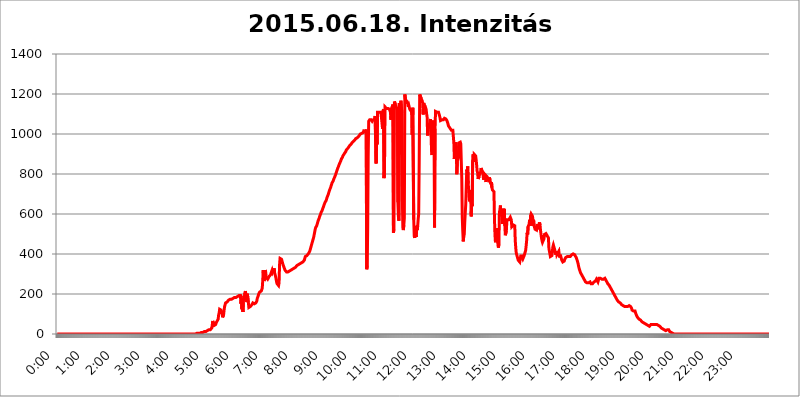
| Category | 2015.06.18. Intenzitás [W/m^2] |
|---|---|
| 0.0 | 0 |
| 0.0006944444444444445 | 0 |
| 0.001388888888888889 | 0 |
| 0.0020833333333333333 | 0 |
| 0.002777777777777778 | 0 |
| 0.003472222222222222 | 0 |
| 0.004166666666666667 | 0 |
| 0.004861111111111111 | 0 |
| 0.005555555555555556 | 0 |
| 0.0062499999999999995 | 0 |
| 0.006944444444444444 | 0 |
| 0.007638888888888889 | 0 |
| 0.008333333333333333 | 0 |
| 0.009027777777777779 | 0 |
| 0.009722222222222222 | 0 |
| 0.010416666666666666 | 0 |
| 0.011111111111111112 | 0 |
| 0.011805555555555555 | 0 |
| 0.012499999999999999 | 0 |
| 0.013194444444444444 | 0 |
| 0.013888888888888888 | 0 |
| 0.014583333333333332 | 0 |
| 0.015277777777777777 | 0 |
| 0.015972222222222224 | 0 |
| 0.016666666666666666 | 0 |
| 0.017361111111111112 | 0 |
| 0.018055555555555557 | 0 |
| 0.01875 | 0 |
| 0.019444444444444445 | 0 |
| 0.02013888888888889 | 0 |
| 0.020833333333333332 | 0 |
| 0.02152777777777778 | 0 |
| 0.022222222222222223 | 0 |
| 0.02291666666666667 | 0 |
| 0.02361111111111111 | 0 |
| 0.024305555555555556 | 0 |
| 0.024999999999999998 | 0 |
| 0.025694444444444447 | 0 |
| 0.02638888888888889 | 0 |
| 0.027083333333333334 | 0 |
| 0.027777777777777776 | 0 |
| 0.02847222222222222 | 0 |
| 0.029166666666666664 | 0 |
| 0.029861111111111113 | 0 |
| 0.030555555555555555 | 0 |
| 0.03125 | 0 |
| 0.03194444444444445 | 0 |
| 0.03263888888888889 | 0 |
| 0.03333333333333333 | 0 |
| 0.034027777777777775 | 0 |
| 0.034722222222222224 | 0 |
| 0.035416666666666666 | 0 |
| 0.036111111111111115 | 0 |
| 0.03680555555555556 | 0 |
| 0.0375 | 0 |
| 0.03819444444444444 | 0 |
| 0.03888888888888889 | 0 |
| 0.03958333333333333 | 0 |
| 0.04027777777777778 | 0 |
| 0.04097222222222222 | 0 |
| 0.041666666666666664 | 0 |
| 0.042361111111111106 | 0 |
| 0.04305555555555556 | 0 |
| 0.043750000000000004 | 0 |
| 0.044444444444444446 | 0 |
| 0.04513888888888889 | 0 |
| 0.04583333333333334 | 0 |
| 0.04652777777777778 | 0 |
| 0.04722222222222222 | 0 |
| 0.04791666666666666 | 0 |
| 0.04861111111111111 | 0 |
| 0.049305555555555554 | 0 |
| 0.049999999999999996 | 0 |
| 0.05069444444444445 | 0 |
| 0.051388888888888894 | 0 |
| 0.052083333333333336 | 0 |
| 0.05277777777777778 | 0 |
| 0.05347222222222222 | 0 |
| 0.05416666666666667 | 0 |
| 0.05486111111111111 | 0 |
| 0.05555555555555555 | 0 |
| 0.05625 | 0 |
| 0.05694444444444444 | 0 |
| 0.057638888888888885 | 0 |
| 0.05833333333333333 | 0 |
| 0.05902777777777778 | 0 |
| 0.059722222222222225 | 0 |
| 0.06041666666666667 | 0 |
| 0.061111111111111116 | 0 |
| 0.06180555555555556 | 0 |
| 0.0625 | 0 |
| 0.06319444444444444 | 0 |
| 0.06388888888888888 | 0 |
| 0.06458333333333334 | 0 |
| 0.06527777777777778 | 0 |
| 0.06597222222222222 | 0 |
| 0.06666666666666667 | 0 |
| 0.06736111111111111 | 0 |
| 0.06805555555555555 | 0 |
| 0.06874999999999999 | 0 |
| 0.06944444444444443 | 0 |
| 0.07013888888888889 | 0 |
| 0.07083333333333333 | 0 |
| 0.07152777777777779 | 0 |
| 0.07222222222222223 | 0 |
| 0.07291666666666667 | 0 |
| 0.07361111111111111 | 0 |
| 0.07430555555555556 | 0 |
| 0.075 | 0 |
| 0.07569444444444444 | 0 |
| 0.0763888888888889 | 0 |
| 0.07708333333333334 | 0 |
| 0.07777777777777778 | 0 |
| 0.07847222222222222 | 0 |
| 0.07916666666666666 | 0 |
| 0.0798611111111111 | 0 |
| 0.08055555555555556 | 0 |
| 0.08125 | 0 |
| 0.08194444444444444 | 0 |
| 0.08263888888888889 | 0 |
| 0.08333333333333333 | 0 |
| 0.08402777777777777 | 0 |
| 0.08472222222222221 | 0 |
| 0.08541666666666665 | 0 |
| 0.08611111111111112 | 0 |
| 0.08680555555555557 | 0 |
| 0.08750000000000001 | 0 |
| 0.08819444444444445 | 0 |
| 0.08888888888888889 | 0 |
| 0.08958333333333333 | 0 |
| 0.09027777777777778 | 0 |
| 0.09097222222222222 | 0 |
| 0.09166666666666667 | 0 |
| 0.09236111111111112 | 0 |
| 0.09305555555555556 | 0 |
| 0.09375 | 0 |
| 0.09444444444444444 | 0 |
| 0.09513888888888888 | 0 |
| 0.09583333333333333 | 0 |
| 0.09652777777777777 | 0 |
| 0.09722222222222222 | 0 |
| 0.09791666666666667 | 0 |
| 0.09861111111111111 | 0 |
| 0.09930555555555555 | 0 |
| 0.09999999999999999 | 0 |
| 0.10069444444444443 | 0 |
| 0.1013888888888889 | 0 |
| 0.10208333333333335 | 0 |
| 0.10277777777777779 | 0 |
| 0.10347222222222223 | 0 |
| 0.10416666666666667 | 0 |
| 0.10486111111111111 | 0 |
| 0.10555555555555556 | 0 |
| 0.10625 | 0 |
| 0.10694444444444444 | 0 |
| 0.1076388888888889 | 0 |
| 0.10833333333333334 | 0 |
| 0.10902777777777778 | 0 |
| 0.10972222222222222 | 0 |
| 0.1111111111111111 | 0 |
| 0.11180555555555556 | 0 |
| 0.11180555555555556 | 0 |
| 0.1125 | 0 |
| 0.11319444444444444 | 0 |
| 0.11388888888888889 | 0 |
| 0.11458333333333333 | 0 |
| 0.11527777777777777 | 0 |
| 0.11597222222222221 | 0 |
| 0.11666666666666665 | 0 |
| 0.1173611111111111 | 0 |
| 0.11805555555555557 | 0 |
| 0.11944444444444445 | 0 |
| 0.12013888888888889 | 0 |
| 0.12083333333333333 | 0 |
| 0.12152777777777778 | 0 |
| 0.12222222222222223 | 0 |
| 0.12291666666666667 | 0 |
| 0.12291666666666667 | 0 |
| 0.12361111111111112 | 0 |
| 0.12430555555555556 | 0 |
| 0.125 | 0 |
| 0.12569444444444444 | 0 |
| 0.12638888888888888 | 0 |
| 0.12708333333333333 | 0 |
| 0.16875 | 0 |
| 0.12847222222222224 | 0 |
| 0.12916666666666668 | 0 |
| 0.12986111111111112 | 0 |
| 0.13055555555555556 | 0 |
| 0.13125 | 0 |
| 0.13194444444444445 | 0 |
| 0.1326388888888889 | 0 |
| 0.13333333333333333 | 0 |
| 0.13402777777777777 | 0 |
| 0.13402777777777777 | 0 |
| 0.13472222222222222 | 0 |
| 0.13541666666666666 | 0 |
| 0.1361111111111111 | 0 |
| 0.13749999999999998 | 0 |
| 0.13819444444444443 | 0 |
| 0.1388888888888889 | 0 |
| 0.13958333333333334 | 0 |
| 0.14027777777777778 | 0 |
| 0.14097222222222222 | 0 |
| 0.14166666666666666 | 0 |
| 0.1423611111111111 | 0 |
| 0.14305555555555557 | 0 |
| 0.14375000000000002 | 0 |
| 0.14444444444444446 | 0 |
| 0.1451388888888889 | 0 |
| 0.1451388888888889 | 0 |
| 0.14652777777777778 | 0 |
| 0.14722222222222223 | 0 |
| 0.14791666666666667 | 0 |
| 0.1486111111111111 | 0 |
| 0.14930555555555555 | 0 |
| 0.15 | 0 |
| 0.15069444444444444 | 0 |
| 0.15138888888888888 | 0 |
| 0.15208333333333332 | 0 |
| 0.15277777777777776 | 0 |
| 0.15347222222222223 | 0 |
| 0.15416666666666667 | 0 |
| 0.15486111111111112 | 0 |
| 0.15555555555555556 | 0 |
| 0.15625 | 0 |
| 0.15694444444444444 | 0 |
| 0.15763888888888888 | 0 |
| 0.15833333333333333 | 0 |
| 0.15902777777777777 | 0 |
| 0.15972222222222224 | 0 |
| 0.16041666666666668 | 0 |
| 0.16111111111111112 | 0 |
| 0.16180555555555556 | 0 |
| 0.1625 | 0 |
| 0.16319444444444445 | 0 |
| 0.1638888888888889 | 0 |
| 0.16458333333333333 | 0 |
| 0.16527777777777777 | 0 |
| 0.16597222222222222 | 0 |
| 0.16666666666666666 | 0 |
| 0.1673611111111111 | 0 |
| 0.16805555555555554 | 0 |
| 0.16874999999999998 | 0 |
| 0.16944444444444443 | 0 |
| 0.17013888888888887 | 0 |
| 0.1708333333333333 | 0 |
| 0.17152777777777775 | 0 |
| 0.17222222222222225 | 0 |
| 0.1729166666666667 | 0 |
| 0.17361111111111113 | 0 |
| 0.17430555555555557 | 0 |
| 0.17500000000000002 | 0 |
| 0.17569444444444446 | 0 |
| 0.1763888888888889 | 0 |
| 0.17708333333333334 | 0 |
| 0.17777777777777778 | 0 |
| 0.17847222222222223 | 0 |
| 0.17916666666666667 | 0 |
| 0.1798611111111111 | 0 |
| 0.18055555555555555 | 0 |
| 0.18125 | 0 |
| 0.18194444444444444 | 0 |
| 0.1826388888888889 | 0 |
| 0.18333333333333335 | 0 |
| 0.1840277777777778 | 0 |
| 0.18472222222222223 | 0 |
| 0.18541666666666667 | 0 |
| 0.18611111111111112 | 0 |
| 0.18680555555555556 | 0 |
| 0.1875 | 0 |
| 0.18819444444444444 | 0 |
| 0.18888888888888888 | 0 |
| 0.18958333333333333 | 0 |
| 0.19027777777777777 | 0 |
| 0.1909722222222222 | 0 |
| 0.19166666666666665 | 0 |
| 0.19236111111111112 | 0 |
| 0.19305555555555554 | 0 |
| 0.19375 | 0 |
| 0.19444444444444445 | 0 |
| 0.1951388888888889 | 3.525 |
| 0.19583333333333333 | 3.525 |
| 0.19652777777777777 | 3.525 |
| 0.19722222222222222 | 3.525 |
| 0.19791666666666666 | 3.525 |
| 0.1986111111111111 | 3.525 |
| 0.19930555555555554 | 3.525 |
| 0.19999999999999998 | 3.525 |
| 0.20069444444444443 | 3.525 |
| 0.20138888888888887 | 7.887 |
| 0.2020833333333333 | 7.887 |
| 0.2027777777777778 | 7.887 |
| 0.2034722222222222 | 7.887 |
| 0.2041666666666667 | 7.887 |
| 0.20486111111111113 | 7.887 |
| 0.20555555555555557 | 12.257 |
| 0.20625000000000002 | 12.257 |
| 0.20694444444444446 | 12.257 |
| 0.2076388888888889 | 12.257 |
| 0.20833333333333334 | 12.257 |
| 0.20902777777777778 | 12.257 |
| 0.20972222222222223 | 16.636 |
| 0.21041666666666667 | 16.636 |
| 0.2111111111111111 | 16.636 |
| 0.21180555555555555 | 16.636 |
| 0.2125 | 21.024 |
| 0.21319444444444444 | 21.024 |
| 0.2138888888888889 | 21.024 |
| 0.21458333333333335 | 21.024 |
| 0.2152777777777778 | 25.419 |
| 0.21597222222222223 | 25.419 |
| 0.21666666666666667 | 29.823 |
| 0.21736111111111112 | 43.079 |
| 0.21805555555555556 | 65.31 |
| 0.21875 | 69.775 |
| 0.21944444444444444 | 60.85 |
| 0.22013888888888888 | 43.079 |
| 0.22083333333333333 | 38.653 |
| 0.22152777777777777 | 43.079 |
| 0.2222222222222222 | 47.511 |
| 0.22291666666666665 | 56.398 |
| 0.2236111111111111 | 60.85 |
| 0.22430555555555556 | 65.31 |
| 0.225 | 65.31 |
| 0.22569444444444445 | 74.246 |
| 0.2263888888888889 | 96.682 |
| 0.22708333333333333 | 105.69 |
| 0.22777777777777777 | 123.758 |
| 0.22847222222222222 | 128.284 |
| 0.22916666666666666 | 123.758 |
| 0.2298611111111111 | 119.235 |
| 0.23055555555555554 | 123.758 |
| 0.23124999999999998 | 101.184 |
| 0.23194444444444443 | 83.205 |
| 0.23263888888888887 | 83.205 |
| 0.2333333333333333 | 96.682 |
| 0.2340277777777778 | 119.235 |
| 0.2347222222222222 | 137.347 |
| 0.2354166666666667 | 146.423 |
| 0.23611111111111113 | 155.509 |
| 0.23680555555555557 | 155.509 |
| 0.23750000000000002 | 160.056 |
| 0.23819444444444446 | 160.056 |
| 0.2388888888888889 | 164.605 |
| 0.23958333333333334 | 164.605 |
| 0.24027777777777778 | 169.156 |
| 0.24097222222222223 | 169.156 |
| 0.24166666666666667 | 173.709 |
| 0.2423611111111111 | 173.709 |
| 0.24305555555555555 | 173.709 |
| 0.24375 | 173.709 |
| 0.24444444444444446 | 173.709 |
| 0.24513888888888888 | 178.264 |
| 0.24583333333333335 | 178.264 |
| 0.2465277777777778 | 178.264 |
| 0.24722222222222223 | 178.264 |
| 0.24791666666666667 | 182.82 |
| 0.24861111111111112 | 182.82 |
| 0.24930555555555556 | 182.82 |
| 0.25 | 182.82 |
| 0.25069444444444444 | 182.82 |
| 0.2513888888888889 | 187.378 |
| 0.2520833333333333 | 187.378 |
| 0.25277777777777777 | 187.378 |
| 0.2534722222222222 | 187.378 |
| 0.25416666666666665 | 191.937 |
| 0.2548611111111111 | 191.937 |
| 0.2555555555555556 | 191.937 |
| 0.25625000000000003 | 196.497 |
| 0.2569444444444445 | 191.937 |
| 0.2576388888888889 | 150.964 |
| 0.25833333333333336 | 173.709 |
| 0.2590277777777778 | 123.758 |
| 0.25972222222222224 | 155.509 |
| 0.2604166666666667 | 110.201 |
| 0.2611111111111111 | 173.709 |
| 0.26180555555555557 | 191.937 |
| 0.2625 | 173.709 |
| 0.26319444444444445 | 205.62 |
| 0.2638888888888889 | 214.746 |
| 0.26458333333333334 | 214.746 |
| 0.2652777777777778 | 219.309 |
| 0.2659722222222222 | 160.056 |
| 0.26666666666666666 | 201.058 |
| 0.2673611111111111 | 205.62 |
| 0.26805555555555555 | 155.509 |
| 0.26875 | 132.814 |
| 0.26944444444444443 | 137.347 |
| 0.2701388888888889 | 137.347 |
| 0.2708333333333333 | 137.347 |
| 0.27152777777777776 | 137.347 |
| 0.2722222222222222 | 141.884 |
| 0.27291666666666664 | 146.423 |
| 0.2736111111111111 | 150.964 |
| 0.2743055555555555 | 155.509 |
| 0.27499999999999997 | 150.964 |
| 0.27569444444444446 | 150.964 |
| 0.27638888888888885 | 150.964 |
| 0.27708333333333335 | 150.964 |
| 0.2777777777777778 | 150.964 |
| 0.27847222222222223 | 155.509 |
| 0.2791666666666667 | 160.056 |
| 0.2798611111111111 | 164.605 |
| 0.28055555555555556 | 178.264 |
| 0.28125 | 182.82 |
| 0.28194444444444444 | 191.937 |
| 0.2826388888888889 | 201.058 |
| 0.2833333333333333 | 205.62 |
| 0.28402777777777777 | 210.182 |
| 0.2847222222222222 | 214.746 |
| 0.28541666666666665 | 214.746 |
| 0.28611111111111115 | 214.746 |
| 0.28680555555555554 | 219.309 |
| 0.28750000000000003 | 228.436 |
| 0.2881944444444445 | 264.932 |
| 0.2888888888888889 | 319.517 |
| 0.28958333333333336 | 278.603 |
| 0.2902777777777778 | 264.932 |
| 0.29097222222222224 | 283.156 |
| 0.2916666666666667 | 319.517 |
| 0.2923611111111111 | 310.44 |
| 0.29305555555555557 | 283.156 |
| 0.29375 | 278.603 |
| 0.29444444444444445 | 278.603 |
| 0.2951388888888889 | 274.047 |
| 0.29583333333333334 | 278.603 |
| 0.2965277777777778 | 278.603 |
| 0.2972222222222222 | 287.709 |
| 0.29791666666666666 | 287.709 |
| 0.2986111111111111 | 287.709 |
| 0.29930555555555555 | 296.808 |
| 0.3 | 305.898 |
| 0.30069444444444443 | 310.44 |
| 0.3013888888888889 | 319.517 |
| 0.3020833333333333 | 310.44 |
| 0.30277777777777776 | 305.898 |
| 0.3034722222222222 | 310.44 |
| 0.30416666666666664 | 328.584 |
| 0.3048611111111111 | 305.898 |
| 0.3055555555555555 | 296.808 |
| 0.30624999999999997 | 287.709 |
| 0.3069444444444444 | 287.709 |
| 0.3076388888888889 | 260.373 |
| 0.30833333333333335 | 251.251 |
| 0.3090277777777778 | 251.251 |
| 0.30972222222222223 | 246.689 |
| 0.3104166666666667 | 242.127 |
| 0.3111111111111111 | 255.813 |
| 0.31180555555555556 | 346.682 |
| 0.3125 | 378.224 |
| 0.31319444444444444 | 382.715 |
| 0.3138888888888889 | 378.224 |
| 0.3145833333333333 | 373.729 |
| 0.31527777777777777 | 364.728 |
| 0.3159722222222222 | 355.712 |
| 0.31666666666666665 | 346.682 |
| 0.31736111111111115 | 342.162 |
| 0.31805555555555554 | 333.113 |
| 0.31875000000000003 | 328.584 |
| 0.3194444444444445 | 319.517 |
| 0.3201388888888889 | 314.98 |
| 0.32083333333333336 | 314.98 |
| 0.3215277777777778 | 310.44 |
| 0.32222222222222224 | 310.44 |
| 0.3229166666666667 | 310.44 |
| 0.3236111111111111 | 310.44 |
| 0.32430555555555557 | 310.44 |
| 0.325 | 310.44 |
| 0.32569444444444445 | 314.98 |
| 0.3263888888888889 | 314.98 |
| 0.32708333333333334 | 314.98 |
| 0.3277777777777778 | 319.517 |
| 0.3284722222222222 | 319.517 |
| 0.32916666666666666 | 319.517 |
| 0.3298611111111111 | 324.052 |
| 0.33055555555555555 | 324.052 |
| 0.33125 | 324.052 |
| 0.33194444444444443 | 328.584 |
| 0.3326388888888889 | 333.113 |
| 0.3333333333333333 | 333.113 |
| 0.3340277777777778 | 333.113 |
| 0.3347222222222222 | 337.639 |
| 0.3354166666666667 | 337.639 |
| 0.3361111111111111 | 342.162 |
| 0.3368055555555556 | 342.162 |
| 0.33749999999999997 | 346.682 |
| 0.33819444444444446 | 346.682 |
| 0.33888888888888885 | 351.198 |
| 0.33958333333333335 | 351.198 |
| 0.34027777777777773 | 351.198 |
| 0.34097222222222223 | 351.198 |
| 0.3416666666666666 | 355.712 |
| 0.3423611111111111 | 355.712 |
| 0.3430555555555555 | 360.221 |
| 0.34375 | 360.221 |
| 0.3444444444444445 | 360.221 |
| 0.3451388888888889 | 364.728 |
| 0.3458333333333334 | 364.728 |
| 0.34652777777777777 | 369.23 |
| 0.34722222222222227 | 369.23 |
| 0.34791666666666665 | 387.202 |
| 0.34861111111111115 | 387.202 |
| 0.34930555555555554 | 387.202 |
| 0.35000000000000003 | 391.685 |
| 0.3506944444444444 | 396.164 |
| 0.3513888888888889 | 396.164 |
| 0.3520833333333333 | 400.638 |
| 0.3527777777777778 | 400.638 |
| 0.3534722222222222 | 405.108 |
| 0.3541666666666667 | 414.035 |
| 0.3548611111111111 | 422.943 |
| 0.35555555555555557 | 431.833 |
| 0.35625 | 440.702 |
| 0.35694444444444445 | 449.551 |
| 0.3576388888888889 | 458.38 |
| 0.35833333333333334 | 467.187 |
| 0.3590277777777778 | 475.972 |
| 0.3597222222222222 | 484.735 |
| 0.36041666666666666 | 497.836 |
| 0.3611111111111111 | 510.885 |
| 0.36180555555555555 | 523.88 |
| 0.3625 | 532.513 |
| 0.36319444444444443 | 536.82 |
| 0.3638888888888889 | 541.121 |
| 0.3645833333333333 | 549.704 |
| 0.3652777777777778 | 558.261 |
| 0.3659722222222222 | 566.793 |
| 0.3666666666666667 | 571.049 |
| 0.3673611111111111 | 579.542 |
| 0.3680555555555556 | 588.009 |
| 0.36874999999999997 | 592.233 |
| 0.36944444444444446 | 600.661 |
| 0.37013888888888885 | 609.062 |
| 0.37083333333333335 | 613.252 |
| 0.37152777777777773 | 617.436 |
| 0.37222222222222223 | 625.784 |
| 0.3729166666666666 | 629.948 |
| 0.3736111111111111 | 638.256 |
| 0.3743055555555555 | 646.537 |
| 0.375 | 650.667 |
| 0.3756944444444445 | 658.909 |
| 0.3763888888888889 | 663.019 |
| 0.3770833333333334 | 667.123 |
| 0.37777777777777777 | 675.311 |
| 0.37847222222222227 | 683.473 |
| 0.37916666666666665 | 687.544 |
| 0.37986111111111115 | 695.666 |
| 0.38055555555555554 | 699.717 |
| 0.38125000000000003 | 711.832 |
| 0.3819444444444444 | 719.877 |
| 0.3826388888888889 | 723.889 |
| 0.3833333333333333 | 731.896 |
| 0.3840277777777778 | 739.877 |
| 0.3847222222222222 | 747.834 |
| 0.3854166666666667 | 755.766 |
| 0.3861111111111111 | 759.723 |
| 0.38680555555555557 | 763.674 |
| 0.3875 | 771.559 |
| 0.38819444444444445 | 775.492 |
| 0.3888888888888889 | 783.342 |
| 0.38958333333333334 | 787.258 |
| 0.3902777777777778 | 795.074 |
| 0.3909722222222222 | 802.868 |
| 0.39166666666666666 | 806.757 |
| 0.3923611111111111 | 818.392 |
| 0.39305555555555555 | 826.123 |
| 0.39375 | 829.981 |
| 0.39444444444444443 | 837.682 |
| 0.3951388888888889 | 845.365 |
| 0.3958333333333333 | 849.199 |
| 0.3965277777777778 | 856.855 |
| 0.3972222222222222 | 860.676 |
| 0.3979166666666667 | 868.305 |
| 0.3986111111111111 | 875.918 |
| 0.3993055555555556 | 879.719 |
| 0.39999999999999997 | 883.516 |
| 0.40069444444444446 | 891.099 |
| 0.40138888888888885 | 894.885 |
| 0.40208333333333335 | 898.668 |
| 0.40277777777777773 | 902.447 |
| 0.40347222222222223 | 906.223 |
| 0.4041666666666666 | 909.996 |
| 0.4048611111111111 | 913.766 |
| 0.4055555555555555 | 921.298 |
| 0.40625 | 925.06 |
| 0.4069444444444445 | 925.06 |
| 0.4076388888888889 | 928.819 |
| 0.4083333333333334 | 932.576 |
| 0.40902777777777777 | 932.576 |
| 0.40972222222222227 | 940.082 |
| 0.41041666666666665 | 940.082 |
| 0.41111111111111115 | 943.832 |
| 0.41180555555555554 | 947.58 |
| 0.41250000000000003 | 947.58 |
| 0.4131944444444444 | 955.071 |
| 0.4138888888888889 | 955.071 |
| 0.4145833333333333 | 958.814 |
| 0.4152777777777778 | 962.555 |
| 0.4159722222222222 | 962.555 |
| 0.4166666666666667 | 966.295 |
| 0.4173611111111111 | 970.034 |
| 0.41805555555555557 | 973.772 |
| 0.41875 | 977.508 |
| 0.41944444444444445 | 977.508 |
| 0.4201388888888889 | 977.508 |
| 0.42083333333333334 | 981.244 |
| 0.4215277777777778 | 981.244 |
| 0.4222222222222222 | 984.98 |
| 0.42291666666666666 | 988.714 |
| 0.4236111111111111 | 988.714 |
| 0.42430555555555555 | 992.448 |
| 0.425 | 999.916 |
| 0.42569444444444443 | 996.182 |
| 0.4263888888888889 | 999.916 |
| 0.4270833333333333 | 1003.65 |
| 0.4277777777777778 | 1003.65 |
| 0.4284722222222222 | 1007.383 |
| 0.4291666666666667 | 1007.383 |
| 0.4298611111111111 | 1014.852 |
| 0.4305555555555556 | 1011.118 |
| 0.43124999999999997 | 1011.118 |
| 0.43194444444444446 | 1011.118 |
| 0.43263888888888885 | 1014.852 |
| 0.43333333333333335 | 1022.323 |
| 0.43402777777777773 | 324.052 |
| 0.43472222222222223 | 342.162 |
| 0.4354166666666666 | 532.513 |
| 0.4361111111111111 | 887.309 |
| 0.4368055555555555 | 1063.51 |
| 0.4375 | 1063.51 |
| 0.4381944444444445 | 1071.027 |
| 0.4388888888888889 | 1071.027 |
| 0.4395833333333334 | 1074.789 |
| 0.44027777777777777 | 1071.027 |
| 0.44097222222222227 | 1067.267 |
| 0.44166666666666665 | 1063.51 |
| 0.44236111111111115 | 1067.267 |
| 0.44305555555555554 | 1071.027 |
| 0.44375000000000003 | 1067.267 |
| 0.4444444444444444 | 1071.027 |
| 0.4451388888888889 | 1074.789 |
| 0.4458333333333333 | 1089.873 |
| 0.4465277777777778 | 1093.653 |
| 0.4472222222222222 | 853.029 |
| 0.4479166666666667 | 970.034 |
| 0.4486111111111111 | 947.58 |
| 0.44930555555555557 | 1108.816 |
| 0.45 | 1108.816 |
| 0.45069444444444445 | 1105.019 |
| 0.4513888888888889 | 1108.816 |
| 0.45208333333333334 | 1112.618 |
| 0.4527777777777778 | 1112.618 |
| 0.4534722222222222 | 1108.816 |
| 0.45416666666666666 | 1101.226 |
| 0.4548611111111111 | 1101.226 |
| 0.45555555555555555 | 1101.226 |
| 0.45625 | 1026.06 |
| 0.45694444444444443 | 1116.426 |
| 0.4576388888888889 | 1124.056 |
| 0.4583333333333333 | 779.42 |
| 0.4590277777777778 | 826.123 |
| 0.4597222222222222 | 1135.543 |
| 0.4604166666666667 | 1139.384 |
| 0.4611111111111111 | 1131.708 |
| 0.4618055555555556 | 1127.879 |
| 0.46249999999999997 | 1124.056 |
| 0.46319444444444446 | 1127.879 |
| 0.46388888888888885 | 1127.879 |
| 0.46458333333333335 | 1124.056 |
| 0.46527777777777773 | 1124.056 |
| 0.46597222222222223 | 1124.056 |
| 0.4666666666666666 | 1124.056 |
| 0.4673611111111111 | 1108.816 |
| 0.4680555555555555 | 1071.027 |
| 0.46875 | 1127.879 |
| 0.4694444444444445 | 1127.879 |
| 0.4701388888888889 | 1139.384 |
| 0.4708333333333334 | 1147.086 |
| 0.47152777777777777 | 506.542 |
| 0.47222222222222227 | 523.88 |
| 0.47291666666666665 | 1162.571 |
| 0.47361111111111115 | 1158.689 |
| 0.47430555555555554 | 1147.086 |
| 0.47500000000000003 | 1139.384 |
| 0.4756944444444444 | 1139.384 |
| 0.4763888888888889 | 1127.879 |
| 0.4770833333333333 | 1135.543 |
| 0.4777777777777778 | 658.909 |
| 0.4784722222222222 | 588.009 |
| 0.4791666666666667 | 566.793 |
| 0.4798611111111111 | 1154.814 |
| 0.48055555555555557 | 898.668 |
| 0.48125 | 940.082 |
| 0.48194444444444445 | 1166.46 |
| 0.4826388888888889 | 1170.358 |
| 0.48333333333333334 | 1105.019 |
| 0.4840277777777778 | 671.22 |
| 0.4847222222222222 | 532.513 |
| 0.48541666666666666 | 519.555 |
| 0.4861111111111111 | 545.416 |
| 0.48680555555555555 | 579.542 |
| 0.4875 | 1197.876 |
| 0.48819444444444443 | 1178.177 |
| 0.4888888888888889 | 1162.571 |
| 0.4895833333333333 | 1150.946 |
| 0.4902777777777778 | 1162.571 |
| 0.4909722222222222 | 1162.571 |
| 0.4916666666666667 | 1154.814 |
| 0.4923611111111111 | 1135.543 |
| 0.4930555555555556 | 1143.232 |
| 0.49374999999999997 | 1139.384 |
| 0.49444444444444446 | 1124.056 |
| 0.49513888888888885 | 1127.879 |
| 0.49583333333333335 | 1124.056 |
| 0.49652777777777773 | 1112.618 |
| 0.49722222222222223 | 1124.056 |
| 0.4979166666666666 | 996.182 |
| 0.4986111111111111 | 1131.708 |
| 0.4993055555555555 | 1131.708 |
| 0.5 | 571.049 |
| 0.5006944444444444 | 489.108 |
| 0.5013888888888889 | 480.356 |
| 0.5020833333333333 | 497.836 |
| 0.5027777777777778 | 493.475 |
| 0.5034722222222222 | 484.735 |
| 0.5041666666666667 | 541.121 |
| 0.5048611111111111 | 519.555 |
| 0.5055555555555555 | 541.121 |
| 0.50625 | 575.299 |
| 0.5069444444444444 | 600.661 |
| 0.5076388888888889 | 856.855 |
| 0.5083333333333333 | 1197.876 |
| 0.5090277777777777 | 1201.843 |
| 0.5097222222222222 | 1193.918 |
| 0.5104166666666666 | 1178.177 |
| 0.5111111111111112 | 1178.177 |
| 0.5118055555555555 | 1166.46 |
| 0.5125000000000001 | 1154.814 |
| 0.5131944444444444 | 1097.437 |
| 0.513888888888889 | 1154.814 |
| 0.5145833333333333 | 1147.086 |
| 0.5152777777777778 | 1150.946 |
| 0.5159722222222222 | 1139.384 |
| 0.5166666666666667 | 1131.708 |
| 0.517361111111111 | 1124.056 |
| 0.5180555555555556 | 1101.226 |
| 0.5187499999999999 | 1086.097 |
| 0.5194444444444445 | 992.448 |
| 0.5201388888888888 | 1029.798 |
| 0.5208333333333334 | 1052.255 |
| 0.5215277777777778 | 1029.798 |
| 0.5222222222222223 | 1044.762 |
| 0.5229166666666667 | 1067.267 |
| 0.5236111111111111 | 1074.789 |
| 0.5243055555555556 | 992.448 |
| 0.525 | 913.766 |
| 0.5256944444444445 | 894.885 |
| 0.5263888888888889 | 955.071 |
| 0.5270833333333333 | 996.182 |
| 0.5277777777777778 | 1067.267 |
| 0.5284722222222222 | 996.182 |
| 0.5291666666666667 | 532.513 |
| 0.5298611111111111 | 1026.06 |
| 0.5305555555555556 | 1112.618 |
| 0.53125 | 1108.816 |
| 0.5319444444444444 | 1108.816 |
| 0.5326388888888889 | 1108.816 |
| 0.5333333333333333 | 1108.816 |
| 0.5340277777777778 | 1112.618 |
| 0.5347222222222222 | 1108.816 |
| 0.5354166666666667 | 1101.226 |
| 0.5361111111111111 | 1097.437 |
| 0.5368055555555555 | 1082.324 |
| 0.5375 | 1067.267 |
| 0.5381944444444444 | 1067.267 |
| 0.5388888888888889 | 1071.027 |
| 0.5395833333333333 | 1071.027 |
| 0.5402777777777777 | 1071.027 |
| 0.5409722222222222 | 1067.267 |
| 0.5416666666666666 | 1071.027 |
| 0.5423611111111112 | 1074.789 |
| 0.5430555555555555 | 1078.555 |
| 0.5437500000000001 | 1082.324 |
| 0.5444444444444444 | 1074.789 |
| 0.545138888888889 | 1074.789 |
| 0.5458333333333333 | 1071.027 |
| 0.5465277777777778 | 1067.267 |
| 0.5472222222222222 | 1059.756 |
| 0.5479166666666667 | 1052.255 |
| 0.548611111111111 | 1041.019 |
| 0.5493055555555556 | 1041.019 |
| 0.5499999999999999 | 1033.537 |
| 0.5506944444444445 | 1029.798 |
| 0.5513888888888888 | 1026.06 |
| 0.5520833333333334 | 1026.06 |
| 0.5527777777777778 | 1018.587 |
| 0.5534722222222223 | 1014.852 |
| 0.5541666666666667 | 1018.587 |
| 0.5548611111111111 | 1018.587 |
| 0.5555555555555556 | 1014.852 |
| 0.55625 | 955.071 |
| 0.5569444444444445 | 875.918 |
| 0.5576388888888889 | 932.576 |
| 0.5583333333333333 | 947.58 |
| 0.5590277777777778 | 958.814 |
| 0.5597222222222222 | 928.819 |
| 0.5604166666666667 | 798.974 |
| 0.5611111111111111 | 860.676 |
| 0.5618055555555556 | 856.855 |
| 0.5625 | 883.516 |
| 0.5631944444444444 | 955.071 |
| 0.5638888888888889 | 955.071 |
| 0.5645833333333333 | 955.071 |
| 0.5652777777777778 | 958.814 |
| 0.5659722222222222 | 951.327 |
| 0.5666666666666667 | 955.071 |
| 0.5673611111111111 | 779.42 |
| 0.5680555555555555 | 583.779 |
| 0.56875 | 515.223 |
| 0.5694444444444444 | 462.786 |
| 0.5701388888888889 | 489.108 |
| 0.5708333333333333 | 497.836 |
| 0.5715277777777777 | 558.261 |
| 0.5722222222222222 | 604.864 |
| 0.5729166666666666 | 646.537 |
| 0.5736111111111112 | 731.896 |
| 0.5743055555555555 | 822.26 |
| 0.5750000000000001 | 814.519 |
| 0.5756944444444444 | 837.682 |
| 0.576388888888889 | 751.803 |
| 0.5770833333333333 | 719.877 |
| 0.5777777777777778 | 675.311 |
| 0.5784722222222222 | 663.019 |
| 0.5791666666666667 | 719.877 |
| 0.579861111111111 | 691.608 |
| 0.5805555555555556 | 588.009 |
| 0.5812499999999999 | 650.667 |
| 0.5819444444444445 | 638.256 |
| 0.5826388888888888 | 868.305 |
| 0.5833333333333334 | 898.668 |
| 0.5840277777777778 | 860.676 |
| 0.5847222222222223 | 898.668 |
| 0.5854166666666667 | 898.668 |
| 0.5861111111111111 | 894.885 |
| 0.5868055555555556 | 891.099 |
| 0.5875 | 872.114 |
| 0.5881944444444445 | 845.365 |
| 0.5888888888888889 | 814.519 |
| 0.5895833333333333 | 806.757 |
| 0.5902777777777778 | 775.492 |
| 0.5909722222222222 | 775.492 |
| 0.5916666666666667 | 787.258 |
| 0.5923611111111111 | 798.974 |
| 0.5930555555555556 | 798.974 |
| 0.59375 | 810.641 |
| 0.5944444444444444 | 829.981 |
| 0.5951388888888889 | 826.123 |
| 0.5958333333333333 | 814.519 |
| 0.5965277777777778 | 818.392 |
| 0.5972222222222222 | 795.074 |
| 0.5979166666666667 | 771.559 |
| 0.5986111111111111 | 802.868 |
| 0.5993055555555555 | 806.757 |
| 0.6 | 798.974 |
| 0.6006944444444444 | 795.074 |
| 0.6013888888888889 | 759.723 |
| 0.6020833333333333 | 791.169 |
| 0.6027777777777777 | 791.169 |
| 0.6034722222222222 | 779.42 |
| 0.6041666666666666 | 775.492 |
| 0.6048611111111112 | 775.492 |
| 0.6055555555555555 | 767.62 |
| 0.6062500000000001 | 783.342 |
| 0.6069444444444444 | 767.62 |
| 0.607638888888889 | 763.674 |
| 0.6083333333333333 | 751.803 |
| 0.6090277777777778 | 759.723 |
| 0.6097222222222222 | 731.896 |
| 0.6104166666666667 | 719.877 |
| 0.611111111111111 | 719.877 |
| 0.6118055555555556 | 723.889 |
| 0.6124999999999999 | 711.832 |
| 0.6131944444444445 | 579.542 |
| 0.6138888888888888 | 497.836 |
| 0.6145833333333334 | 458.38 |
| 0.6152777777777778 | 458.38 |
| 0.6159722222222223 | 528.2 |
| 0.6166666666666667 | 528.2 |
| 0.6173611111111111 | 515.223 |
| 0.6180555555555556 | 445.129 |
| 0.61875 | 431.833 |
| 0.6194444444444445 | 449.551 |
| 0.6201388888888889 | 609.062 |
| 0.6208333333333333 | 621.613 |
| 0.6215277777777778 | 642.4 |
| 0.6222222222222222 | 609.062 |
| 0.6229166666666667 | 625.784 |
| 0.6236111111111111 | 588.009 |
| 0.6243055555555556 | 549.704 |
| 0.625 | 613.252 |
| 0.6256944444444444 | 625.784 |
| 0.6263888888888889 | 613.252 |
| 0.6270833333333333 | 625.784 |
| 0.6277777777777778 | 541.121 |
| 0.6284722222222222 | 493.475 |
| 0.6291666666666667 | 489.108 |
| 0.6298611111111111 | 515.223 |
| 0.6305555555555555 | 562.53 |
| 0.63125 | 571.049 |
| 0.6319444444444444 | 575.299 |
| 0.6326388888888889 | 571.049 |
| 0.6333333333333333 | 571.049 |
| 0.6340277777777777 | 571.049 |
| 0.6347222222222222 | 575.299 |
| 0.6354166666666666 | 583.779 |
| 0.6361111111111112 | 583.779 |
| 0.6368055555555555 | 571.049 |
| 0.6375000000000001 | 536.82 |
| 0.6381944444444444 | 532.513 |
| 0.638888888888889 | 541.121 |
| 0.6395833333333333 | 545.416 |
| 0.6402777777777778 | 549.704 |
| 0.6409722222222222 | 541.121 |
| 0.6416666666666667 | 541.121 |
| 0.642361111111111 | 467.187 |
| 0.6430555555555556 | 431.833 |
| 0.6437499999999999 | 405.108 |
| 0.6444444444444445 | 396.164 |
| 0.6451388888888888 | 391.685 |
| 0.6458333333333334 | 378.224 |
| 0.6465277777777778 | 369.23 |
| 0.6472222222222223 | 369.23 |
| 0.6479166666666667 | 364.728 |
| 0.6486111111111111 | 360.221 |
| 0.6493055555555556 | 378.224 |
| 0.65 | 373.729 |
| 0.6506944444444445 | 396.164 |
| 0.6513888888888889 | 382.715 |
| 0.6520833333333333 | 378.224 |
| 0.6527777777777778 | 373.729 |
| 0.6534722222222222 | 373.729 |
| 0.6541666666666667 | 378.224 |
| 0.6548611111111111 | 391.685 |
| 0.6555555555555556 | 400.638 |
| 0.65625 | 409.574 |
| 0.6569444444444444 | 418.492 |
| 0.6576388888888889 | 440.702 |
| 0.6583333333333333 | 467.187 |
| 0.6590277777777778 | 506.542 |
| 0.6597222222222222 | 497.836 |
| 0.6604166666666667 | 536.82 |
| 0.6611111111111111 | 541.121 |
| 0.6618055555555555 | 549.704 |
| 0.6625 | 571.049 |
| 0.6631944444444444 | 541.121 |
| 0.6638888888888889 | 592.233 |
| 0.6645833333333333 | 600.661 |
| 0.6652777777777777 | 600.661 |
| 0.6659722222222222 | 600.661 |
| 0.6666666666666666 | 588.009 |
| 0.6673611111111111 | 541.121 |
| 0.6680555555555556 | 571.049 |
| 0.6687500000000001 | 541.121 |
| 0.6694444444444444 | 536.82 |
| 0.6701388888888888 | 523.88 |
| 0.6708333333333334 | 528.2 |
| 0.6715277777777778 | 523.88 |
| 0.6722222222222222 | 519.555 |
| 0.6729166666666666 | 523.88 |
| 0.6736111111111112 | 549.704 |
| 0.6743055555555556 | 545.416 |
| 0.6749999999999999 | 523.88 |
| 0.6756944444444444 | 549.704 |
| 0.6763888888888889 | 558.261 |
| 0.6770833333333334 | 545.416 |
| 0.6777777777777777 | 519.555 |
| 0.6784722222222223 | 515.223 |
| 0.6791666666666667 | 480.356 |
| 0.6798611111111111 | 467.187 |
| 0.6805555555555555 | 458.38 |
| 0.68125 | 458.38 |
| 0.6819444444444445 | 462.786 |
| 0.6826388888888889 | 475.972 |
| 0.6833333333333332 | 497.836 |
| 0.6840277777777778 | 502.192 |
| 0.6847222222222222 | 502.192 |
| 0.6854166666666667 | 502.192 |
| 0.686111111111111 | 502.192 |
| 0.6868055555555556 | 497.836 |
| 0.6875 | 489.108 |
| 0.6881944444444444 | 484.735 |
| 0.688888888888889 | 480.356 |
| 0.6895833333333333 | 427.39 |
| 0.6902777777777778 | 431.833 |
| 0.6909722222222222 | 400.638 |
| 0.6916666666666668 | 387.202 |
| 0.6923611111111111 | 387.202 |
| 0.6930555555555555 | 387.202 |
| 0.69375 | 391.685 |
| 0.6944444444444445 | 414.035 |
| 0.6951388888888889 | 436.27 |
| 0.6958333333333333 | 445.129 |
| 0.6965277777777777 | 436.27 |
| 0.6972222222222223 | 431.833 |
| 0.6979166666666666 | 418.492 |
| 0.6986111111111111 | 414.035 |
| 0.6993055555555556 | 396.164 |
| 0.7000000000000001 | 414.035 |
| 0.7006944444444444 | 396.164 |
| 0.7013888888888888 | 391.685 |
| 0.7020833333333334 | 405.108 |
| 0.7027777777777778 | 409.574 |
| 0.7034722222222222 | 414.035 |
| 0.7041666666666666 | 391.685 |
| 0.7048611111111112 | 382.715 |
| 0.7055555555555556 | 396.164 |
| 0.7062499999999999 | 387.202 |
| 0.7069444444444444 | 378.224 |
| 0.7076388888888889 | 369.23 |
| 0.7083333333333334 | 364.728 |
| 0.7090277777777777 | 360.221 |
| 0.7097222222222223 | 360.221 |
| 0.7104166666666667 | 360.221 |
| 0.7111111111111111 | 364.728 |
| 0.7118055555555555 | 373.729 |
| 0.7125 | 378.224 |
| 0.7131944444444445 | 382.715 |
| 0.7138888888888889 | 387.202 |
| 0.7145833333333332 | 387.202 |
| 0.7152777777777778 | 387.202 |
| 0.7159722222222222 | 387.202 |
| 0.7166666666666667 | 387.202 |
| 0.717361111111111 | 387.202 |
| 0.7180555555555556 | 387.202 |
| 0.71875 | 387.202 |
| 0.7194444444444444 | 387.202 |
| 0.720138888888889 | 391.685 |
| 0.7208333333333333 | 391.685 |
| 0.7215277777777778 | 396.164 |
| 0.7222222222222222 | 400.638 |
| 0.7229166666666668 | 400.638 |
| 0.7236111111111111 | 400.638 |
| 0.7243055555555555 | 400.638 |
| 0.725 | 396.164 |
| 0.7256944444444445 | 396.164 |
| 0.7263888888888889 | 396.164 |
| 0.7270833333333333 | 391.685 |
| 0.7277777777777777 | 382.715 |
| 0.7284722222222223 | 378.224 |
| 0.7291666666666666 | 369.23 |
| 0.7298611111111111 | 360.221 |
| 0.7305555555555556 | 351.198 |
| 0.7312500000000001 | 337.639 |
| 0.7319444444444444 | 328.584 |
| 0.7326388888888888 | 319.517 |
| 0.7333333333333334 | 314.98 |
| 0.7340277777777778 | 305.898 |
| 0.7347222222222222 | 301.354 |
| 0.7354166666666666 | 296.808 |
| 0.7361111111111112 | 292.259 |
| 0.7368055555555556 | 287.709 |
| 0.7374999999999999 | 283.156 |
| 0.7381944444444444 | 278.603 |
| 0.7388888888888889 | 274.047 |
| 0.7395833333333334 | 269.49 |
| 0.7402777777777777 | 264.932 |
| 0.7409722222222223 | 260.373 |
| 0.7416666666666667 | 260.373 |
| 0.7423611111111111 | 255.813 |
| 0.7430555555555555 | 255.813 |
| 0.74375 | 251.251 |
| 0.7444444444444445 | 251.251 |
| 0.7451388888888889 | 255.813 |
| 0.7458333333333332 | 260.373 |
| 0.7465277777777778 | 260.373 |
| 0.7472222222222222 | 260.373 |
| 0.7479166666666667 | 255.813 |
| 0.748611111111111 | 251.251 |
| 0.7493055555555556 | 246.689 |
| 0.75 | 251.251 |
| 0.7506944444444444 | 251.251 |
| 0.751388888888889 | 255.813 |
| 0.7520833333333333 | 255.813 |
| 0.7527777777777778 | 260.373 |
| 0.7534722222222222 | 260.373 |
| 0.7541666666666668 | 260.373 |
| 0.7548611111111111 | 264.932 |
| 0.7555555555555555 | 269.49 |
| 0.75625 | 274.047 |
| 0.7569444444444445 | 278.603 |
| 0.7576388888888889 | 269.49 |
| 0.7583333333333333 | 260.373 |
| 0.7590277777777777 | 269.49 |
| 0.7597222222222223 | 278.603 |
| 0.7604166666666666 | 278.603 |
| 0.7611111111111111 | 274.047 |
| 0.7618055555555556 | 278.603 |
| 0.7625000000000001 | 278.603 |
| 0.7631944444444444 | 274.047 |
| 0.7638888888888888 | 274.047 |
| 0.7645833333333334 | 278.603 |
| 0.7652777777777778 | 278.603 |
| 0.7659722222222222 | 274.047 |
| 0.7666666666666666 | 278.603 |
| 0.7673611111111112 | 278.603 |
| 0.7680555555555556 | 278.603 |
| 0.7687499999999999 | 274.047 |
| 0.7694444444444444 | 269.49 |
| 0.7701388888888889 | 264.932 |
| 0.7708333333333334 | 260.373 |
| 0.7715277777777777 | 255.813 |
| 0.7722222222222223 | 251.251 |
| 0.7729166666666667 | 246.689 |
| 0.7736111111111111 | 246.689 |
| 0.7743055555555555 | 242.127 |
| 0.775 | 242.127 |
| 0.7756944444444445 | 233 |
| 0.7763888888888889 | 228.436 |
| 0.7770833333333332 | 223.873 |
| 0.7777777777777778 | 219.309 |
| 0.7784722222222222 | 214.746 |
| 0.7791666666666667 | 210.182 |
| 0.779861111111111 | 205.62 |
| 0.7805555555555556 | 201.058 |
| 0.78125 | 196.497 |
| 0.7819444444444444 | 191.937 |
| 0.782638888888889 | 187.378 |
| 0.7833333333333333 | 182.82 |
| 0.7840277777777778 | 178.264 |
| 0.7847222222222222 | 173.709 |
| 0.7854166666666668 | 169.156 |
| 0.7861111111111111 | 164.605 |
| 0.7868055555555555 | 164.605 |
| 0.7875 | 160.056 |
| 0.7881944444444445 | 160.056 |
| 0.7888888888888889 | 160.056 |
| 0.7895833333333333 | 155.509 |
| 0.7902777777777777 | 155.509 |
| 0.7909722222222223 | 150.964 |
| 0.7916666666666666 | 146.423 |
| 0.7923611111111111 | 146.423 |
| 0.7930555555555556 | 146.423 |
| 0.7937500000000001 | 141.884 |
| 0.7944444444444444 | 137.347 |
| 0.7951388888888888 | 141.884 |
| 0.7958333333333334 | 137.347 |
| 0.7965277777777778 | 137.347 |
| 0.7972222222222222 | 137.347 |
| 0.7979166666666666 | 137.347 |
| 0.7986111111111112 | 137.347 |
| 0.7993055555555556 | 137.347 |
| 0.7999999999999999 | 137.347 |
| 0.8006944444444444 | 137.347 |
| 0.8013888888888889 | 141.884 |
| 0.8020833333333334 | 141.884 |
| 0.8027777777777777 | 141.884 |
| 0.8034722222222223 | 141.884 |
| 0.8041666666666667 | 137.347 |
| 0.8048611111111111 | 132.814 |
| 0.8055555555555555 | 128.284 |
| 0.80625 | 119.235 |
| 0.8069444444444445 | 119.235 |
| 0.8076388888888889 | 119.235 |
| 0.8083333333333332 | 114.716 |
| 0.8090277777777778 | 114.716 |
| 0.8097222222222222 | 114.716 |
| 0.8104166666666667 | 114.716 |
| 0.811111111111111 | 105.69 |
| 0.8118055555555556 | 101.184 |
| 0.8125 | 92.184 |
| 0.8131944444444444 | 87.692 |
| 0.813888888888889 | 83.205 |
| 0.8145833333333333 | 83.205 |
| 0.8152777777777778 | 78.722 |
| 0.8159722222222222 | 74.246 |
| 0.8166666666666668 | 74.246 |
| 0.8173611111111111 | 69.775 |
| 0.8180555555555555 | 69.775 |
| 0.81875 | 65.31 |
| 0.8194444444444445 | 65.31 |
| 0.8201388888888889 | 60.85 |
| 0.8208333333333333 | 60.85 |
| 0.8215277777777777 | 56.398 |
| 0.8222222222222223 | 56.398 |
| 0.8229166666666666 | 56.398 |
| 0.8236111111111111 | 51.951 |
| 0.8243055555555556 | 51.951 |
| 0.8250000000000001 | 51.951 |
| 0.8256944444444444 | 47.511 |
| 0.8263888888888888 | 47.511 |
| 0.8270833333333334 | 47.511 |
| 0.8277777777777778 | 47.511 |
| 0.8284722222222222 | 43.079 |
| 0.8291666666666666 | 43.079 |
| 0.8298611111111112 | 43.079 |
| 0.8305555555555556 | 38.653 |
| 0.8312499999999999 | 43.079 |
| 0.8319444444444444 | 43.079 |
| 0.8326388888888889 | 47.511 |
| 0.8333333333333334 | 47.511 |
| 0.8340277777777777 | 47.511 |
| 0.8347222222222223 | 47.511 |
| 0.8354166666666667 | 47.511 |
| 0.8361111111111111 | 47.511 |
| 0.8368055555555555 | 47.511 |
| 0.8375 | 47.511 |
| 0.8381944444444445 | 47.511 |
| 0.8388888888888889 | 47.511 |
| 0.8395833333333332 | 47.511 |
| 0.8402777777777778 | 47.511 |
| 0.8409722222222222 | 47.511 |
| 0.8416666666666667 | 47.511 |
| 0.842361111111111 | 43.079 |
| 0.8430555555555556 | 43.079 |
| 0.84375 | 43.079 |
| 0.8444444444444444 | 38.653 |
| 0.845138888888889 | 38.653 |
| 0.8458333333333333 | 34.234 |
| 0.8465277777777778 | 34.234 |
| 0.8472222222222222 | 29.823 |
| 0.8479166666666668 | 29.823 |
| 0.8486111111111111 | 25.419 |
| 0.8493055555555555 | 25.419 |
| 0.85 | 21.024 |
| 0.8506944444444445 | 21.024 |
| 0.8513888888888889 | 21.024 |
| 0.8520833333333333 | 21.024 |
| 0.8527777777777777 | 21.024 |
| 0.8534722222222223 | 16.636 |
| 0.8541666666666666 | 21.024 |
| 0.8548611111111111 | 21.024 |
| 0.8555555555555556 | 21.024 |
| 0.8562500000000001 | 21.024 |
| 0.8569444444444444 | 21.024 |
| 0.8576388888888888 | 21.024 |
| 0.8583333333333334 | 16.636 |
| 0.8590277777777778 | 12.257 |
| 0.8597222222222222 | 12.257 |
| 0.8604166666666666 | 7.887 |
| 0.8611111111111112 | 7.887 |
| 0.8618055555555556 | 3.525 |
| 0.8624999999999999 | 3.525 |
| 0.8631944444444444 | 3.525 |
| 0.8638888888888889 | 3.525 |
| 0.8645833333333334 | 3.525 |
| 0.8652777777777777 | 0 |
| 0.8659722222222223 | 0 |
| 0.8666666666666667 | 0 |
| 0.8673611111111111 | 0 |
| 0.8680555555555555 | 0 |
| 0.86875 | 0 |
| 0.8694444444444445 | 0 |
| 0.8701388888888889 | 0 |
| 0.8708333333333332 | 0 |
| 0.8715277777777778 | 0 |
| 0.8722222222222222 | 0 |
| 0.8729166666666667 | 0 |
| 0.873611111111111 | 0 |
| 0.8743055555555556 | 0 |
| 0.875 | 0 |
| 0.8756944444444444 | 0 |
| 0.876388888888889 | 0 |
| 0.8770833333333333 | 0 |
| 0.8777777777777778 | 0 |
| 0.8784722222222222 | 0 |
| 0.8791666666666668 | 0 |
| 0.8798611111111111 | 0 |
| 0.8805555555555555 | 0 |
| 0.88125 | 0 |
| 0.8819444444444445 | 0 |
| 0.8826388888888889 | 0 |
| 0.8833333333333333 | 0 |
| 0.8840277777777777 | 0 |
| 0.8847222222222223 | 0 |
| 0.8854166666666666 | 0 |
| 0.8861111111111111 | 0 |
| 0.8868055555555556 | 0 |
| 0.8875000000000001 | 0 |
| 0.8881944444444444 | 0 |
| 0.8888888888888888 | 0 |
| 0.8895833333333334 | 0 |
| 0.8902777777777778 | 0 |
| 0.8909722222222222 | 0 |
| 0.8916666666666666 | 0 |
| 0.8923611111111112 | 0 |
| 0.8930555555555556 | 0 |
| 0.8937499999999999 | 0 |
| 0.8944444444444444 | 0 |
| 0.8951388888888889 | 0 |
| 0.8958333333333334 | 0 |
| 0.8965277777777777 | 0 |
| 0.8972222222222223 | 0 |
| 0.8979166666666667 | 0 |
| 0.8986111111111111 | 0 |
| 0.8993055555555555 | 0 |
| 0.9 | 0 |
| 0.9006944444444445 | 0 |
| 0.9013888888888889 | 0 |
| 0.9020833333333332 | 0 |
| 0.9027777777777778 | 0 |
| 0.9034722222222222 | 0 |
| 0.9041666666666667 | 0 |
| 0.904861111111111 | 0 |
| 0.9055555555555556 | 0 |
| 0.90625 | 0 |
| 0.9069444444444444 | 0 |
| 0.907638888888889 | 0 |
| 0.9083333333333333 | 0 |
| 0.9090277777777778 | 0 |
| 0.9097222222222222 | 0 |
| 0.9104166666666668 | 0 |
| 0.9111111111111111 | 0 |
| 0.9118055555555555 | 0 |
| 0.9125 | 0 |
| 0.9131944444444445 | 0 |
| 0.9138888888888889 | 0 |
| 0.9145833333333333 | 0 |
| 0.9152777777777777 | 0 |
| 0.9159722222222223 | 0 |
| 0.9166666666666666 | 0 |
| 0.9173611111111111 | 0 |
| 0.9180555555555556 | 0 |
| 0.9187500000000001 | 0 |
| 0.9194444444444444 | 0 |
| 0.9201388888888888 | 0 |
| 0.9208333333333334 | 0 |
| 0.9215277777777778 | 0 |
| 0.9222222222222222 | 0 |
| 0.9229166666666666 | 0 |
| 0.9236111111111112 | 0 |
| 0.9243055555555556 | 0 |
| 0.9249999999999999 | 0 |
| 0.9256944444444444 | 0 |
| 0.9263888888888889 | 0 |
| 0.9270833333333334 | 0 |
| 0.9277777777777777 | 0 |
| 0.9284722222222223 | 0 |
| 0.9291666666666667 | 0 |
| 0.9298611111111111 | 0 |
| 0.9305555555555555 | 0 |
| 0.93125 | 0 |
| 0.9319444444444445 | 0 |
| 0.9326388888888889 | 0 |
| 0.9333333333333332 | 0 |
| 0.9340277777777778 | 0 |
| 0.9347222222222222 | 0 |
| 0.9354166666666667 | 0 |
| 0.936111111111111 | 0 |
| 0.9368055555555556 | 0 |
| 0.9375 | 0 |
| 0.9381944444444444 | 0 |
| 0.938888888888889 | 0 |
| 0.9395833333333333 | 0 |
| 0.9402777777777778 | 0 |
| 0.9409722222222222 | 0 |
| 0.9416666666666668 | 0 |
| 0.9423611111111111 | 0 |
| 0.9430555555555555 | 0 |
| 0.94375 | 0 |
| 0.9444444444444445 | 0 |
| 0.9451388888888889 | 0 |
| 0.9458333333333333 | 0 |
| 0.9465277777777777 | 0 |
| 0.9472222222222223 | 0 |
| 0.9479166666666666 | 0 |
| 0.9486111111111111 | 0 |
| 0.9493055555555556 | 0 |
| 0.9500000000000001 | 0 |
| 0.9506944444444444 | 0 |
| 0.9513888888888888 | 0 |
| 0.9520833333333334 | 0 |
| 0.9527777777777778 | 0 |
| 0.9534722222222222 | 0 |
| 0.9541666666666666 | 0 |
| 0.9548611111111112 | 0 |
| 0.9555555555555556 | 0 |
| 0.9562499999999999 | 0 |
| 0.9569444444444444 | 0 |
| 0.9576388888888889 | 0 |
| 0.9583333333333334 | 0 |
| 0.9590277777777777 | 0 |
| 0.9597222222222223 | 0 |
| 0.9604166666666667 | 0 |
| 0.9611111111111111 | 0 |
| 0.9618055555555555 | 0 |
| 0.9625 | 0 |
| 0.9631944444444445 | 0 |
| 0.9638888888888889 | 0 |
| 0.9645833333333332 | 0 |
| 0.9652777777777778 | 0 |
| 0.9659722222222222 | 0 |
| 0.9666666666666667 | 0 |
| 0.967361111111111 | 0 |
| 0.9680555555555556 | 0 |
| 0.96875 | 0 |
| 0.9694444444444444 | 0 |
| 0.970138888888889 | 0 |
| 0.9708333333333333 | 0 |
| 0.9715277777777778 | 0 |
| 0.9722222222222222 | 0 |
| 0.9729166666666668 | 0 |
| 0.9736111111111111 | 0 |
| 0.9743055555555555 | 0 |
| 0.975 | 0 |
| 0.9756944444444445 | 0 |
| 0.9763888888888889 | 0 |
| 0.9770833333333333 | 0 |
| 0.9777777777777777 | 0 |
| 0.9784722222222223 | 0 |
| 0.9791666666666666 | 0 |
| 0.9798611111111111 | 0 |
| 0.9805555555555556 | 0 |
| 0.9812500000000001 | 0 |
| 0.9819444444444444 | 0 |
| 0.9826388888888888 | 0 |
| 0.9833333333333334 | 0 |
| 0.9840277777777778 | 0 |
| 0.9847222222222222 | 0 |
| 0.9854166666666666 | 0 |
| 0.9861111111111112 | 0 |
| 0.9868055555555556 | 0 |
| 0.9874999999999999 | 0 |
| 0.9881944444444444 | 0 |
| 0.9888888888888889 | 0 |
| 0.9895833333333334 | 0 |
| 0.9902777777777777 | 0 |
| 0.9909722222222223 | 0 |
| 0.9916666666666667 | 0 |
| 0.9923611111111111 | 0 |
| 0.9930555555555555 | 0 |
| 0.99375 | 0 |
| 0.9944444444444445 | 0 |
| 0.9951388888888889 | 0 |
| 0.9958333333333332 | 0 |
| 0.9965277777777778 | 0 |
| 0.9972222222222222 | 0 |
| 0.9979166666666667 | 0 |
| 0.998611111111111 | 0 |
| 0.9993055555555556 | 0 |